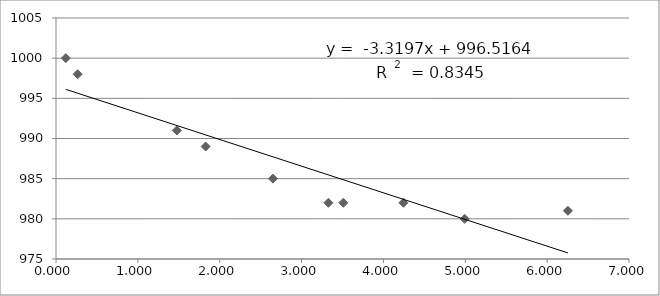
| Category | Series 0 |
|---|---|
| 3.51 | 982 |
| 3.328 | 982 |
| 0.264 | 998 |
| 6.254 | 981 |
| 1.828 | 989 |
| 4.992 | 980 |
| 1.476 | 991 |
| 2.65 | 985 |
| 4.244 | 982 |
| 0.12 | 1000 |